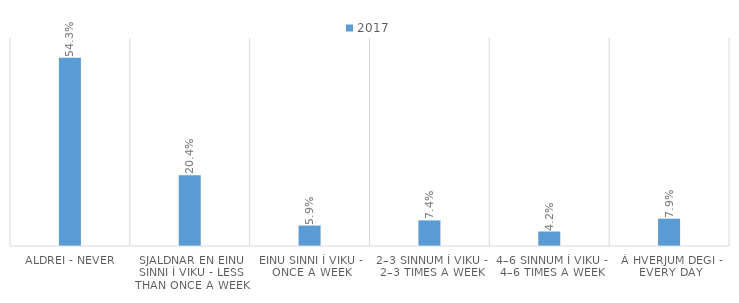
| Category | 2017 |
|---|---|
| Aldrei - Never | 0.543 |
| Sjaldnar en einu sinni í viku - Less than once a week | 0.204 |
| Einu sinni í viku - Once a week | 0.059 |
| 2–3 sinnum í viku - 2–3 times a week | 0.074 |
| 4–6 sinnum í viku - 4–6 times a week | 0.042 |
| Á hverjum degi - Every day | 0.079 |